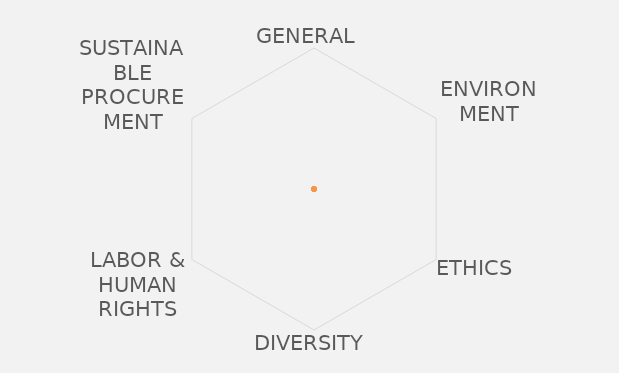
| Category | Series 0 |
|---|---|
| GENERAL  | 0 |
| ENVIRONMENT | 0 |
| ETHICS | 0 |
| DIVERSITY | 0 |
| LABOR & HUMAN RIGHTS | 0 |
| SUSTAINABLE PROCUREMENT | 0 |